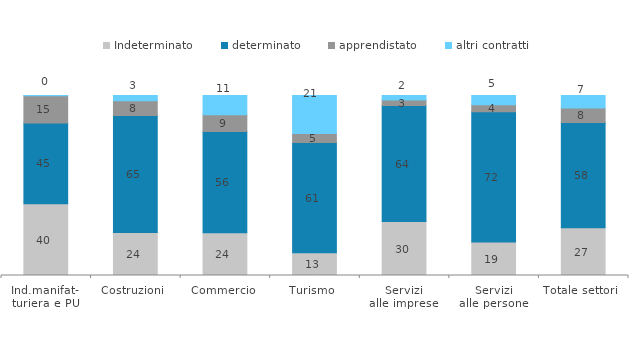
| Category | Indeterminato | determinato | apprendistato | altri contratti |
|---|---|---|---|---|
| Ind.manifat-
turiera e PU | 39.868 | 44.899 | 15.024 | 0.208 |
| Costruzioni | 23.905 | 64.964 | 8.212 | 2.92 |
| Commercio | 23.779 | 56.183 | 9.321 | 10.717 |
| Turismo | 12.591 | 61.285 | 5.068 | 21.055 |
| Servizi
alle imprese | 29.974 | 64.416 | 3.169 | 2.442 |
| Servizi
alle persone | 18.576 | 72.446 | 3.901 | 5.077 |
| Totale settori | 26.508 | 58.493 | 8.087 | 6.911 |